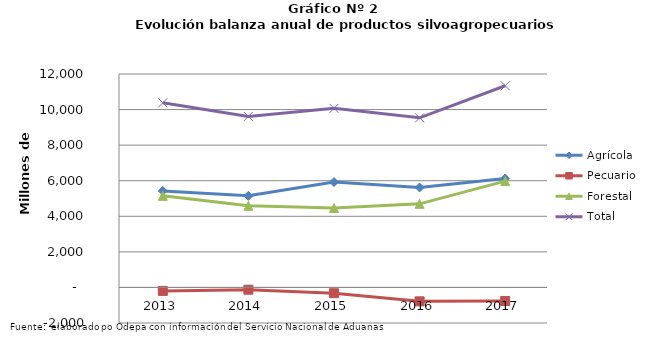
| Category | Agrícola | Pecuario | Forestal | Total |
|---|---|---|---|---|
| 2013.0 | 5424524 | -195643 | 5149868 | 10378749 |
| 2014.0 | 5149872 | -127785 | 4591408 | 9613495 |
| 2015.0 | 5924661 | -325380 | 4468104 | 10067385 |
| 2016.0 | 5619304 | -782588 | 4700192 | 9536908 |
| 2017.0 | 6124335 | -761791 | 5977245 | 11339789 |